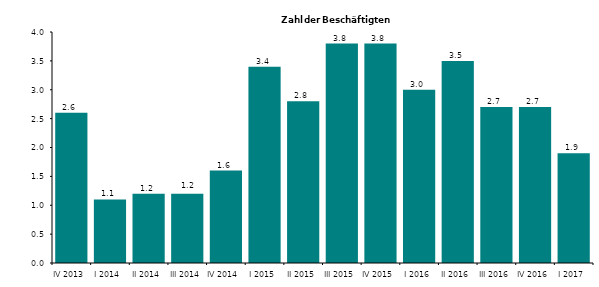
| Category | 2,6 1,1 1,2 1,2 1,6 3,4 2,8 3,8 3,8 3,0 3,5 2,7 2,7 1,9 |
|---|---|
| IV 2013 | 2.6 |
| I 2014 | 1.1 |
| II 2014 | 1.2 |
| III 2014 | 1.2 |
| IV 2014 | 1.6 |
| I 2015 | 3.4 |
| II 2015 | 2.8 |
| III 2015 | 3.8 |
| IV 2015 | 3.8 |
| I 2016 | 3 |
| II 2016 | 3.5 |
| III 2016 | 2.7 |
| IV 2016 | 2.7 |
| I 2017 | 1.9 |